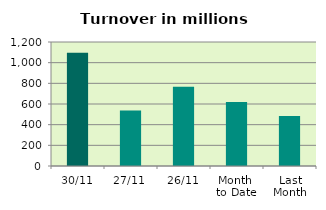
| Category | Series 0 |
|---|---|
| 30/11 | 1095.015 |
| 27/11 | 536.305 |
| 26/11 | 767.752 |
| Month 
to Date | 619.399 |
| Last
Month | 482.722 |